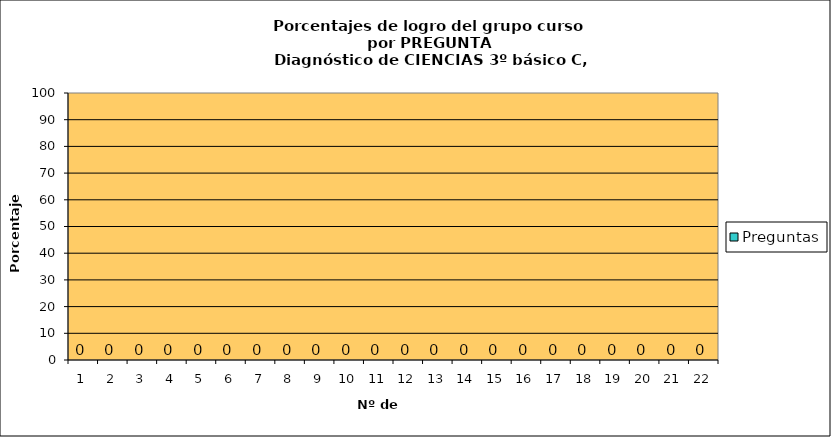
| Category | Preguntas |
|---|---|
| 0 | 0 |
| 1 | 0 |
| 2 | 0 |
| 3 | 0 |
| 4 | 0 |
| 5 | 0 |
| 6 | 0 |
| 7 | 0 |
| 8 | 0 |
| 9 | 0 |
| 10 | 0 |
| 11 | 0 |
| 12 | 0 |
| 13 | 0 |
| 14 | 0 |
| 15 | 0 |
| 16 | 0 |
| 17 | 0 |
| 18 | 0 |
| 19 | 0 |
| 20 | 0 |
| 21 | 0 |